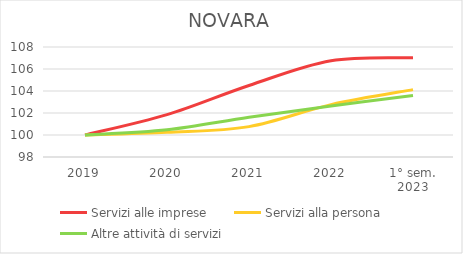
| Category | Servizi alle imprese | Servizi alla persona | Altre attività di servizi |
|---|---|---|---|
| 2019 | 100 | 100 | 100 |
| 2020 | 101.851 | 100.24 | 100.467 |
| 2021 | 104.503 | 100.761 | 101.613 |
| 2022 | 106.755 | 102.764 | 102.641 |
| 1° sem.
2023 | 107.033 | 104.127 | 103.599 |